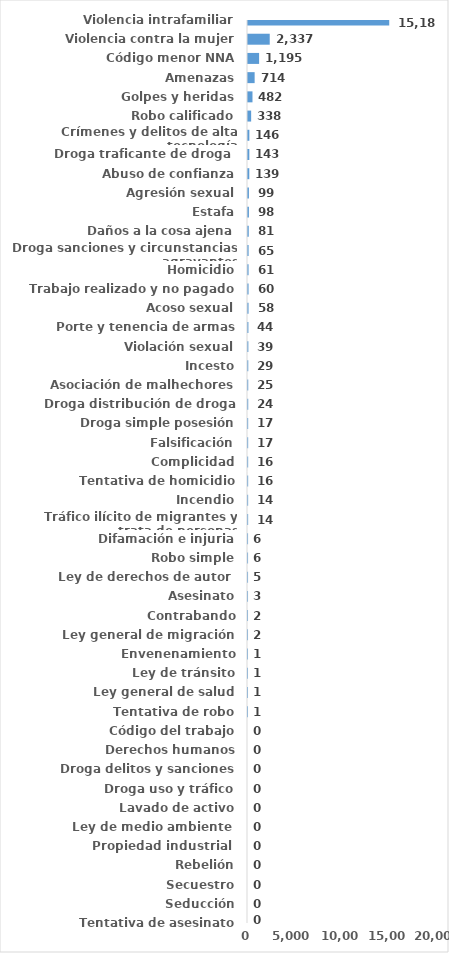
| Category | Series 0 |
|---|---|
| Violencia intrafamiliar | 15186 |
| Violencia contra la mujer | 2337 |
| Código menor NNA | 1195 |
| Amenazas | 714 |
| Golpes y heridas | 482 |
| Robo calificado | 338 |
| Crímenes y delitos de alta tecnología | 146 |
| Droga traficante de droga  | 143 |
| Abuso de confianza | 139 |
| Agresión sexual | 99 |
| Estafa | 98 |
| Daños a la cosa ajena | 81 |
| Droga sanciones y circunstancias agravantes | 65 |
| Homicidio | 61 |
| Trabajo realizado y no pagado | 60 |
| Acoso sexual | 58 |
| Porte y tenencia de armas | 44 |
| Violación sexual | 39 |
| Incesto | 29 |
| Asociación de malhechores | 25 |
| Droga distribución de droga | 24 |
| Droga simple posesión | 17 |
| Falsificación | 17 |
| Complicidad | 16 |
| Tentativa de homicidio | 16 |
| Incendio | 14 |
| Tráfico ilícito de migrantes y trata de personas | 14 |
| Difamación e injuria | 6 |
| Robo simple | 6 |
| Ley de derechos de autor  | 5 |
| Asesinato | 3 |
| Contrabando | 2 |
| Ley general de migración | 2 |
| Envenenamiento | 1 |
| Ley de tránsito | 1 |
| Ley general de salud | 1 |
| Tentativa de robo | 1 |
| Código del trabajo | 0 |
| Derechos humanos | 0 |
| Droga delitos y sanciones | 0 |
| Droga uso y tráfico | 0 |
| Lavado de activo | 0 |
| Ley de medio ambiente  | 0 |
| Propiedad industrial  | 0 |
| Rebelión | 0 |
| Secuestro | 0 |
| Seducción | 0 |
| Tentativa de asesinato | 0 |